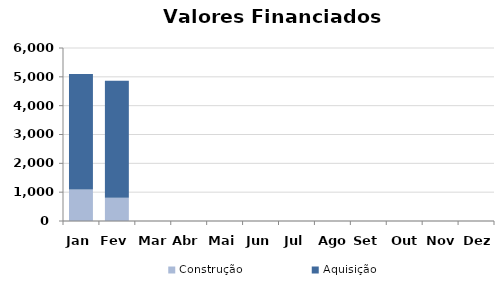
| Category | Construção | Aquisição  |
|---|---|---|
| Jan | 1091.225 | 4005.43 |
| Fev | 806.874 | 4059.044 |
| Mar | 0 | 0 |
| Abr | 0 | 0 |
| Mai | 0 | 0 |
| Jun | 0 | 0 |
| Jul | 0 | 0 |
| Ago | 0 | 0 |
| Set | 0 | 0 |
| Out | 0 | 0 |
| Nov | 0 | 0 |
| Dez | 0 | 0 |